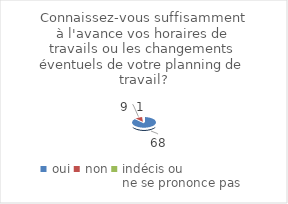
| Category | Connaissez-vous suffisamment à l'avance vos horaires de travails ou les changements éventuels de votre planning de travail? |
|---|---|
| oui | 68 |
| non | 9 |
| indécis ou 
ne se prononce pas | 1 |